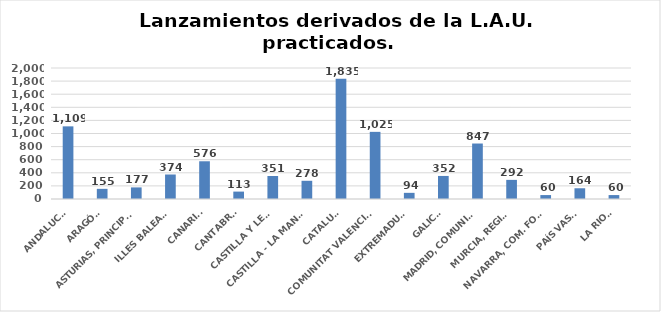
| Category | 616 |
|---|---|
| ANDALUCÍA | 1109 |
| ARAGÓN | 155 |
| ASTURIAS, PRINCIPADO | 177 |
| ILLES BALEARS | 374 |
| CANARIAS | 576 |
| CANTABRIA | 113 |
| CASTILLA Y LEÓN | 351 |
| CASTILLA - LA MANCHA | 278 |
| CATALUÑA | 1835 |
| COMUNITAT VALENCIANA | 1025 |
| EXTREMADURA | 94 |
| GALICIA | 352 |
| MADRID, COMUNIDAD | 847 |
| MURCIA, REGIÓN | 292 |
| NAVARRA, COM. FORAL | 60 |
| PAÍS VASCO | 164 |
| LA RIOJA | 60 |